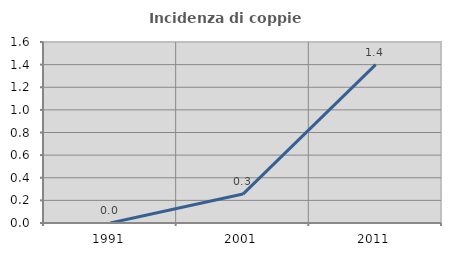
| Category | Incidenza di coppie miste |
|---|---|
| 1991.0 | 0 |
| 2001.0 | 0.256 |
| 2011.0 | 1.401 |